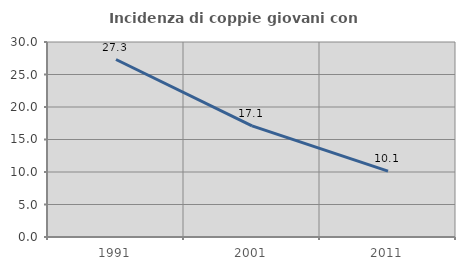
| Category | Incidenza di coppie giovani con figli |
|---|---|
| 1991.0 | 27.306 |
| 2001.0 | 17.097 |
| 2011.0 | 10.123 |